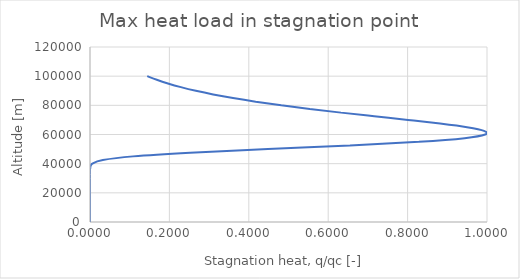
| Category | Series 0 |
|---|---|
| 0.14411308650247637 | 100000 |
| 0.16824749849648932 | 97500 |
| 0.1963219342429035 | 95000 |
| 0.2289188264211284 | 92500 |
| 0.26666981815280366 | 90000 |
| 0.31023564285808497 | 87500 |
| 0.36026679434097447 | 85000 |
| 0.4173336669854822 | 82500 |
| 0.4818096596495476 | 80000 |
| 0.5536844029084684 | 77500 |
| 0.6322781359106259 | 75000 |
| 0.7158263079489187 | 72500 |
| 0.800915037880781 | 70000 |
| 0.8817918392228498 | 67500 |
| 0.949683686289183 | 65000 |
| 0.9924661837047032 | 62500 |
| 0.9953583486292337 | 60000 |
| 0.943656034859516 | 57500 |
| 0.8284319304367935 | 55000 |
| 0.654726089049559 | 52500 |
| 0.44820797785985195 | 50000 |
| 0.2521344733948143 | 47500 |
| 0.10845218596077726 | 45000 |
| 0.03232541602319519 | 42500 |
| 0.005835959714075955 | 40000 |
| 0.0005309680216360073 | 37500 |
| 1.8933764069727728e-05 | 35000 |
| 1.876691935254094e-07 | 32500 |
| 3.232733766030217e-10 | 30000 |
| 5.093058414688081e-14 | 27500 |
| 3.051824400197042e-19 | 25000 |
| 2.0963600313963167e-26 | 22500 |
| 3.2046794057858224e-36 | 20000 |
| 1.1599677590391188e-49 | 17500 |
| 4.649659661806377e-68 | 15000 |
| 3.138894007989337e-93 | 12500 |
| 1.168669333149617e-127 | 10000 |
| 9.634272119008366e-175 | 7500 |
| 4.007764133159523e-239 | 5000 |
| 0.0 | 2500 |
| 0.0 | 0 |